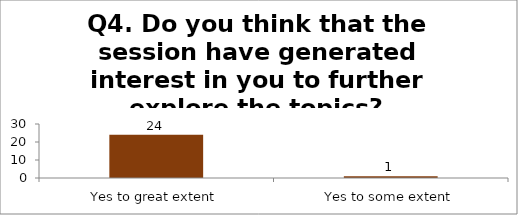
| Category | Q4. Do you think that the session have generated interest in you to further explore the topics? |
|---|---|
| Yes to great extent | 24 |
| Yes to some extent | 1 |